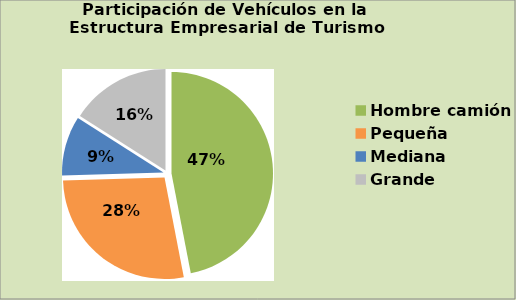
| Category | Series 0 |
|---|---|
| Hombre camión | 46.952 |
| Pequeña | 27.581 |
| Mediana | 9.497 |
| Grande | 15.969 |